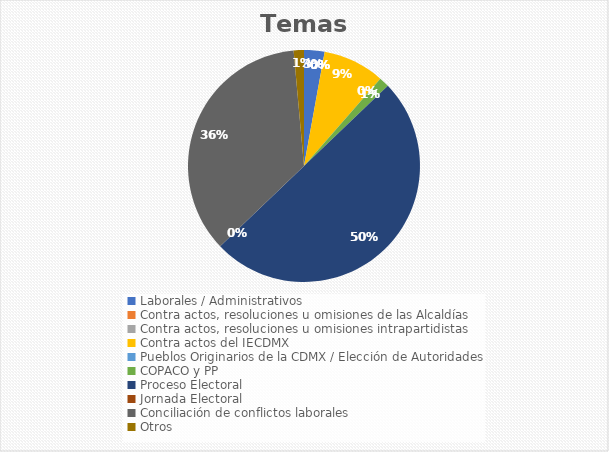
| Category | Temas |
|---|---|
| Laborales / Administrativos | 2 |
| Contra actos, resoluciones u omisiones de las Alcaldías | 0 |
| Contra actos, resoluciones u omisiones intrapartidistas | 0 |
| Contra actos del IECDMX | 6 |
| Pueblos Originarios de la CDMX / Elección de Autoridades | 0 |
| COPACO y PP | 1 |
| Proceso Electoral | 35 |
| Jornada Electoral | 0 |
| Conciliación de conflictos laborales | 25 |
| Otros | 1 |